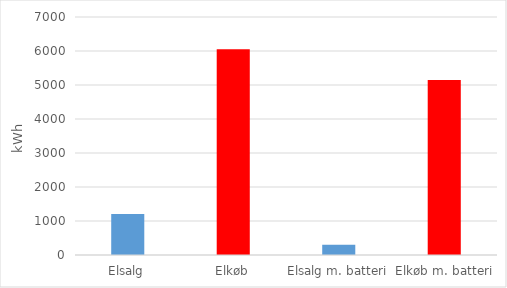
| Category | Series 0 |
|---|---|
| Elsalg | 1205.378 |
| Elkøb | 6053.175 |
| Elsalg m. batteri | 303.296 |
| Elkøb m. batteri | 5146.093 |